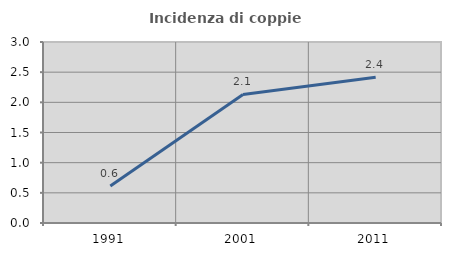
| Category | Incidenza di coppie miste |
|---|---|
| 1991.0 | 0.614 |
| 2001.0 | 2.131 |
| 2011.0 | 2.417 |